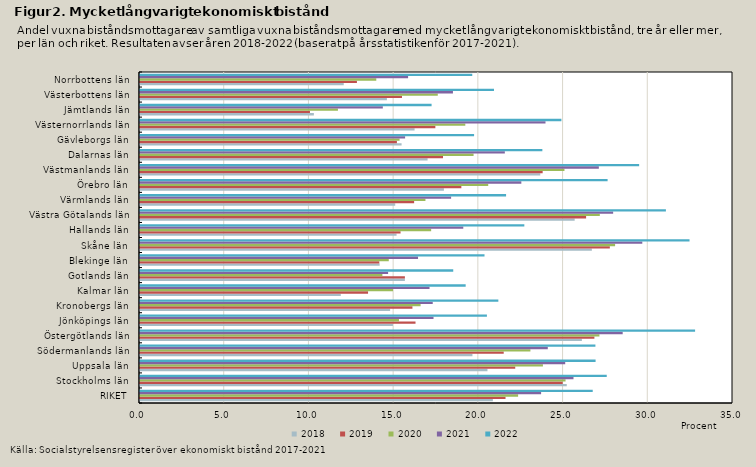
| Category | 2018 | 2019 | 2020 | 2021 | 2022 |
|---|---|---|---|---|---|
| RIKET | 20.826 | 21.574 | 22.317 | 23.674 | 26.721 |
| Stockholms län | 25.187 | 24.949 | 25.116 | 25.585 | 27.548 |
| Uppsala län | 20.508 | 22.147 | 23.781 | 25.097 | 26.89 |
| Södermanlands län | 19.621 | 21.467 | 23.043 | 24.068 | 26.88 |
| Östergötlands län | 26.081 | 26.82 | 27.116 | 28.489 | 32.763 |
| Jönköpings län | 14.93 | 16.262 | 15.285 | 17.324 | 20.475 |
| Kronobergs län | 14.762 | 16.079 | 16.561 | 17.278 | 21.15 |
| Kalmar län | 11.85 | 13.46 | 14.934 | 17.089 | 19.222 |
| Gotlands län | 15.634 | 15.634 | 14.306 | 14.644 | 18.488 |
| Blekinge län | 14.144 | 14.124 | 14.683 | 16.41 | 20.334 |
| Skåne län | 26.669 | 27.731 | 28.041 | 29.647 | 32.434 |
| Hallands län | 15.143 | 15.378 | 17.185 | 19.081 | 22.684 |
| Västra Götalands län | 25.655 | 26.33 | 27.14 | 27.926 | 31.04 |
| Värmlands län | 15.064 | 16.18 | 16.848 | 18.362 | 21.607 |
| Örebro län | 17.938 | 18.967 | 20.553 | 22.507 | 27.599 |
| Västmanlands län | 23.625 | 23.766 | 25.053 | 27.081 | 29.461 |
| Dalarnas län | 16.974 | 17.884 | 19.688 | 21.533 | 23.748 |
| Gävleborgs län | 15.439 | 15.163 | 15.32 | 15.647 | 19.718 |
| Västernorrlands län | 16.206 | 17.432 | 19.2 | 23.933 | 24.873 |
| Jämtlands län | 10.263 | 10.032 | 11.682 | 14.332 | 17.21 |
| Västerbottens län | 14.572 | 15.463 | 17.576 | 18.47 | 20.893 |
| Norrbottens län | 12.025 | 12.803 | 13.946 | 15.824 | 19.61 |